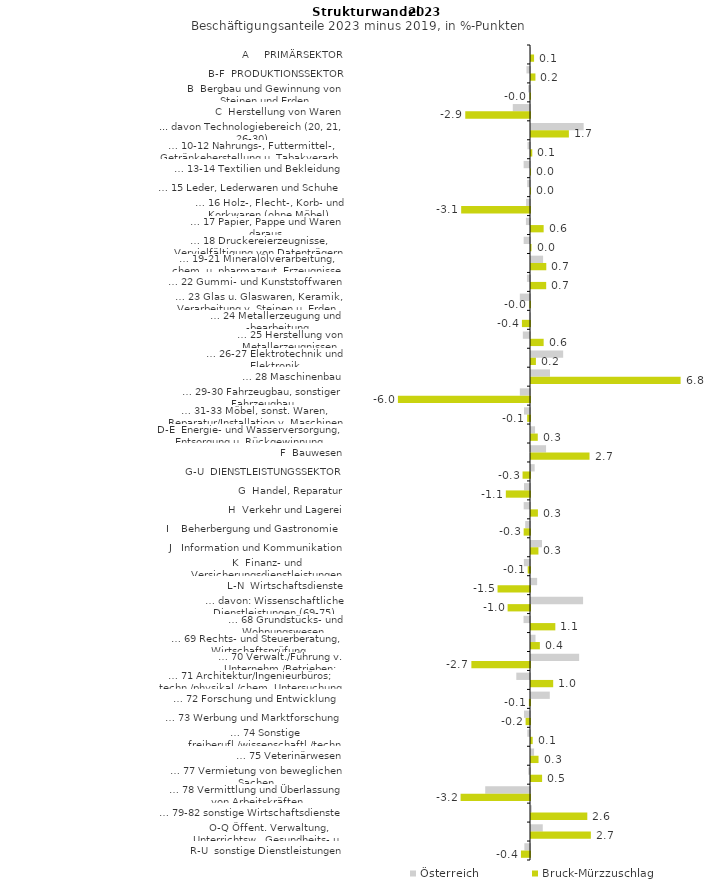
| Category | Österreich | Bruck-Mürzzuschlag |
|---|---|---|
| A     PRIMÄRSEKTOR | -0.007 | 0.139 |
| B-F  PRODUKTIONSSEKTOR | -0.161 | 0.202 |
| B  Bergbau und Gewinnung von Steinen und Erden | -0.086 | -0.019 |
| C  Herstellung von Waren | -0.782 | -2.943 |
| ... davon Technologiebereich (20, 21, 26-30) | 2.393 | 1.722 |
| … 10-12 Nahrungs-, Futtermittel-, Getränkeherstellung u. Tabakverarb. | -0.116 | 0.058 |
| … 13-14 Textilien und Bekleidung | -0.289 | 0 |
| … 15 Leder, Lederwaren und Schuhe | -0.13 | 0 |
| … 16 Holz-, Flecht-, Korb- und Korkwaren (ohne Möbel)  | -0.177 | -3.129 |
| … 17 Papier, Pappe und Waren daraus  | -0.185 | 0.575 |
| … 18 Druckereierzeugnisse, Vervielfältigung von Datenträgern | -0.288 | 0.023 |
| … 19-21 Mineralölverarbeitung, chem. u. pharmazeut. Erzeugnisse | 0.549 | 0.695 |
| … 22 Gummi- und Kunststoffwaren | -0.139 | 0.69 |
| … 23 Glas u. Glaswaren, Keramik, Verarbeitung v. Steinen u. Erden  | -0.462 | -0.027 |
| … 24 Metallerzeugung und -bearbeitung | -0.032 | -0.367 |
| … 25 Herstellung von Metallerzeugnissen  | -0.325 | 0.575 |
| … 26-27 Elektrotechnik und Elektronik | 1.462 | 0.223 |
| … 28 Maschinenbau | 0.864 | 6.8 |
| … 29-30 Fahrzeugbau, sonstiger Fahrzeugbau | -0.462 | -6.004 |
| … 31-33 Möbel, sonst. Waren, Reparatur/Installation v. Maschinen | -0.273 | -0.129 |
| D-E  Energie- und Wasserversorgung, Entsorgung u. Rückgewinnung | 0.184 | 0.308 |
| F  Bauwesen | 0.684 | 2.66 |
| G-U  DIENSTLEISTUNGSSEKTOR | 0.167 | -0.338 |
| G  Handel, Reparatur | -0.273 | -1.098 |
| H  Verkehr und Lagerei | -0.287 | 0.315 |
| I    Beherbergung und Gastronomie | -0.218 | -0.288 |
| J   Information und Kommunikation | 0.499 | 0.337 |
| K  Finanz- und Versicherungsdienstleistungen | -0.279 | -0.105 |
| L-N  Wirtschaftsdienste | 0.279 | -1.475 |
| … davon: Wissenschaftliche Dienstleistungen (69-75) | 2.367 | -1.018 |
| … 68 Grundstücks- und Wohnungswesen  | -0.294 | 1.106 |
| … 69 Rechts- und Steuerberatung, Wirtschaftsprüfung | 0.205 | 0.403 |
| … 70 Verwalt./Führung v. Unternehm./Betrieben; Unternehmensberat. | 2.188 | -2.665 |
| … 71 Architektur/Ingenieurbüros; techn./physikal./chem. Untersuchung | -0.622 | 1.009 |
| … 72 Forschung und Entwicklung  | 0.854 | -0.051 |
| … 73 Werbung und Marktforschung | -0.273 | -0.2 |
| … 74 Sonstige freiberufl./wissenschaftl./techn. Tätigkeiten | -0.124 | 0.077 |
| … 75 Veterinärwesen | 0.14 | 0.342 |
| … 77 Vermietung von beweglichen Sachen  | -0.077 | 0.505 |
| … 78 Vermittlung und Überlassung von Arbeitskräften | -2.035 | -3.155 |
| … 79-82 sonstige Wirtschaftsdienste | 0.039 | 2.559 |
| O-Q Öffent. Verwaltung, Unterrichtsw., Gesundheits- u. Sozialwesen | 0.535 | 2.721 |
| R-U  sonstige Dienstleistungen | -0.256 | -0.411 |